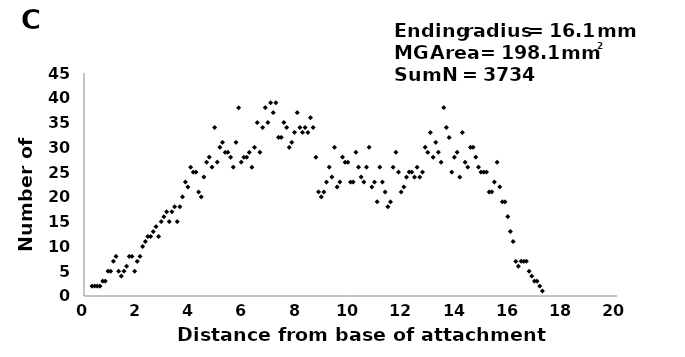
| Category | Series 0 |
|---|---|
| 0.3 | 2 |
| 0.4 | 2 |
| 0.5 | 2 |
| 0.6 | 2 |
| 0.7 | 3 |
| 0.8 | 3 |
| 0.9 | 5 |
| 1.0 | 5 |
| 1.1 | 7 |
| 1.2 | 8 |
| 1.3 | 5 |
| 1.4 | 4 |
| 1.5 | 5 |
| 1.6 | 6 |
| 1.7 | 8 |
| 1.8 | 8 |
| 1.9 | 5 |
| 2.0 | 7 |
| 2.1 | 8 |
| 2.2 | 10 |
| 2.3 | 11 |
| 2.4 | 12 |
| 2.5 | 12 |
| 2.6 | 13 |
| 2.7 | 14 |
| 2.8 | 12 |
| 2.9 | 15 |
| 3.0 | 16 |
| 3.1 | 17 |
| 3.2 | 15 |
| 3.3 | 17 |
| 3.4 | 18 |
| 3.5 | 15 |
| 3.6 | 18 |
| 3.7 | 20 |
| 3.8 | 23 |
| 3.9 | 22 |
| 4.0 | 26 |
| 4.1 | 25 |
| 4.2 | 25 |
| 4.3 | 21 |
| 4.4 | 20 |
| 4.5 | 24 |
| 4.6 | 27 |
| 4.7 | 28 |
| 4.8 | 26 |
| 4.9 | 34 |
| 5.0 | 27 |
| 5.1 | 30 |
| 5.2 | 31 |
| 5.3 | 29 |
| 5.4 | 29 |
| 5.5 | 28 |
| 5.6 | 26 |
| 5.7 | 31 |
| 5.8 | 38 |
| 5.9 | 27 |
| 6.0 | 28 |
| 6.1 | 28 |
| 6.2 | 29 |
| 6.3 | 26 |
| 6.4 | 30 |
| 6.5 | 35 |
| 6.6 | 29 |
| 6.7 | 34 |
| 6.8 | 38 |
| 6.9 | 35 |
| 7.0 | 39 |
| 7.1 | 37 |
| 7.2 | 39 |
| 7.3 | 32 |
| 7.4 | 32 |
| 7.5 | 35 |
| 7.6 | 34 |
| 7.7 | 30 |
| 7.8 | 31 |
| 7.9 | 33 |
| 8.0 | 37 |
| 8.1 | 34 |
| 8.2 | 33 |
| 8.3 | 34 |
| 8.4 | 33 |
| 8.5 | 36 |
| 8.6 | 34 |
| 8.7 | 28 |
| 8.8 | 21 |
| 8.9 | 20 |
| 9.0 | 21 |
| 9.1 | 23 |
| 9.2 | 26 |
| 9.3 | 24 |
| 9.4 | 30 |
| 9.5 | 22 |
| 9.6 | 23 |
| 9.7 | 28 |
| 9.8 | 27 |
| 9.9 | 27 |
| 10.0 | 23 |
| 10.1 | 23 |
| 10.2 | 29 |
| 10.3 | 26 |
| 10.4 | 24 |
| 10.5 | 23 |
| 10.6 | 26 |
| 10.7 | 30 |
| 10.8 | 22 |
| 10.9 | 23 |
| 11.0 | 19 |
| 11.1 | 26 |
| 11.2 | 23 |
| 11.3 | 21 |
| 11.4 | 18 |
| 11.5 | 19 |
| 11.6 | 26 |
| 11.7 | 29 |
| 11.8 | 25 |
| 11.9 | 21 |
| 12.0 | 22 |
| 12.1 | 24 |
| 12.2 | 25 |
| 12.3 | 25 |
| 12.4 | 24 |
| 12.5 | 26 |
| 12.6 | 24 |
| 12.7 | 25 |
| 12.8 | 30 |
| 12.9 | 29 |
| 13.0 | 33 |
| 13.1 | 28 |
| 13.2 | 31 |
| 13.3 | 29 |
| 13.4 | 27 |
| 13.5 | 38 |
| 13.6 | 34 |
| 13.7 | 32 |
| 13.8 | 25 |
| 13.9 | 28 |
| 14.0 | 29 |
| 14.1 | 24 |
| 14.2 | 33 |
| 14.3 | 27 |
| 14.4 | 26 |
| 14.5 | 30 |
| 14.6 | 30 |
| 14.7 | 28 |
| 14.8 | 26 |
| 14.9 | 25 |
| 15.0 | 25 |
| 15.1 | 25 |
| 15.2 | 21 |
| 15.3 | 21 |
| 15.4 | 23 |
| 15.5 | 27 |
| 15.6 | 22 |
| 15.7 | 19 |
| 15.8 | 19 |
| 15.9 | 16 |
| 16.0 | 13 |
| 16.1 | 11 |
| 16.2 | 7 |
| 16.3 | 6 |
| 16.4 | 7 |
| 16.5 | 7 |
| 16.6 | 7 |
| 16.7 | 5 |
| 16.8 | 4 |
| 16.9 | 3 |
| 17.0 | 3 |
| 17.1 | 2 |
| 17.2 | 1 |